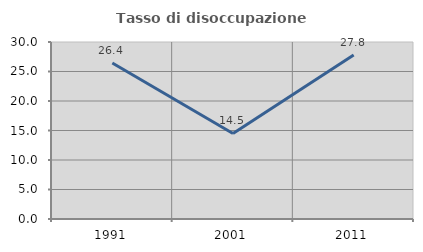
| Category | Tasso di disoccupazione giovanile  |
|---|---|
| 1991.0 | 26.442 |
| 2001.0 | 14.493 |
| 2011.0 | 27.778 |